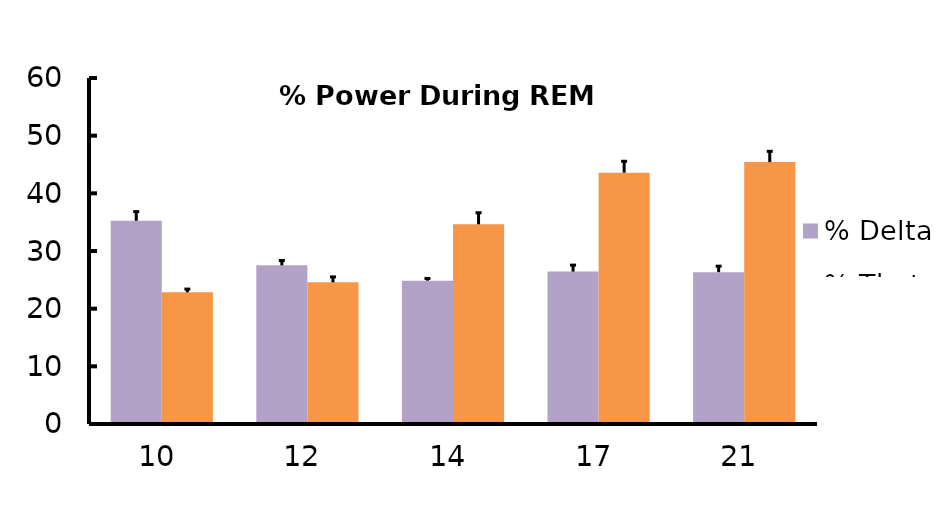
| Category | % Delta | % Theta |
|---|---|---|
| 10 | 35.248 | 22.836 |
| 12 | 27.516 | 24.569 |
| 14 | 24.857 | 34.632 |
| 17 | 26.428 | 43.589 |
| 21 | 26.336 | 45.422 |